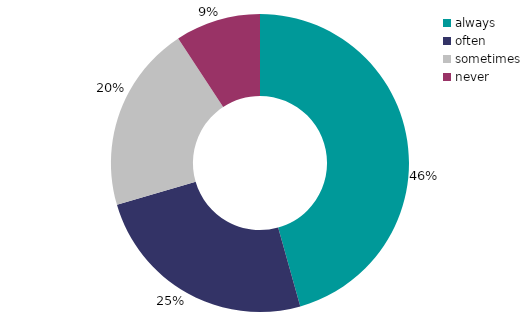
| Category | Series 1 |
|---|---|
| always | 45.641 |
| often | 24.847 |
| sometimes | 20.264 |
| never | 9.249 |